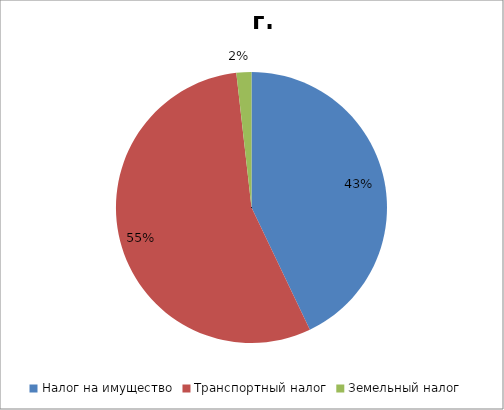
| Category | г. Москва |
|---|---|
| Налог на имущество  | 16206561656.43 |
| Транспортный налог  | 20885328763.84 |
| Земельный налог  | 675949431.57 |